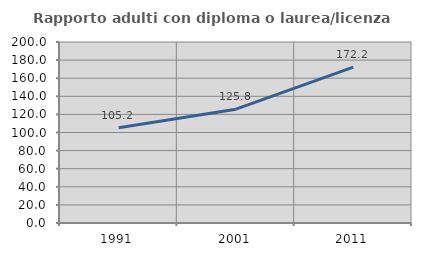
| Category | Rapporto adulti con diploma o laurea/licenza media  |
|---|---|
| 1991.0 | 105.213 |
| 2001.0 | 125.802 |
| 2011.0 | 172.236 |